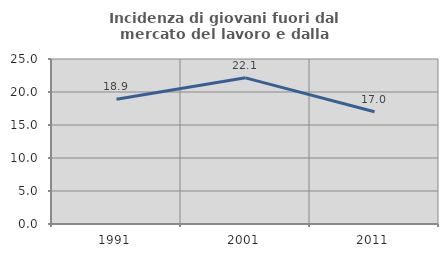
| Category | Incidenza di giovani fuori dal mercato del lavoro e dalla formazione  |
|---|---|
| 1991.0 | 18.917 |
| 2001.0 | 22.145 |
| 2011.0 | 17.013 |